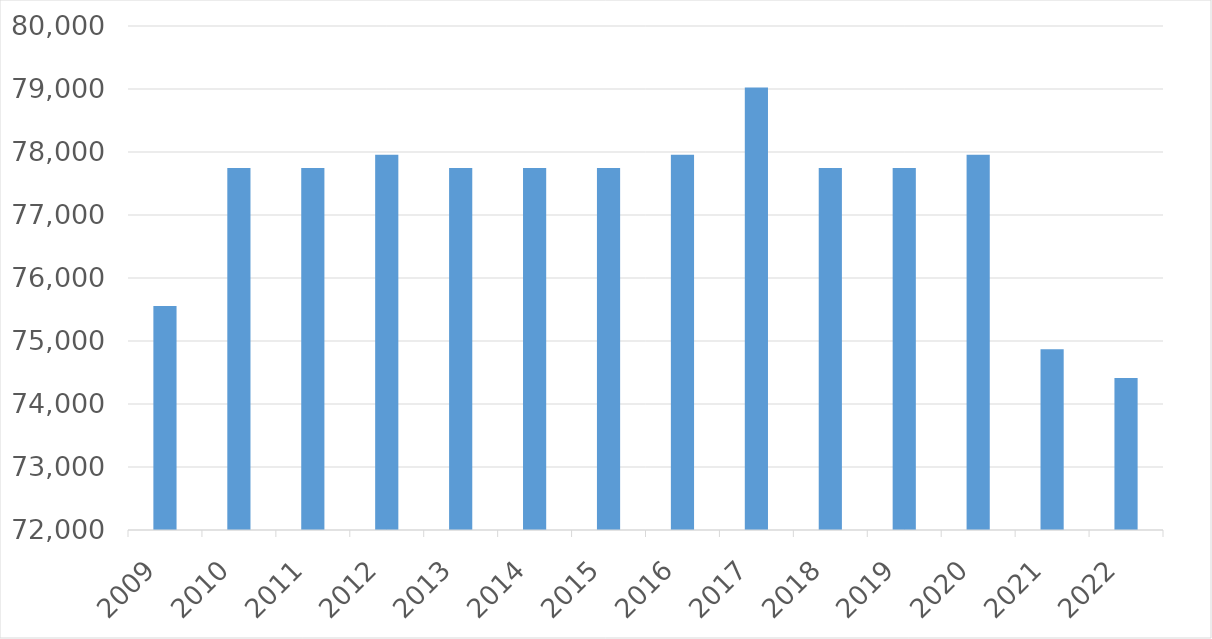
| Category | Series 0 |
|---|---|
| 2009 | 75555 |
| 2010 | 77745 |
| 2011 | 77745 |
| 2012 | 77958 |
| 2013 | 77745 |
| 2014 | 77745 |
| 2015 | 77745 |
| 2016 | 77958 |
| 2017 | 79023 |
| 2018 | 77745 |
| 2019 | 77745 |
| 2020 | 77958 |
| 2021 | 74871 |
| 2022 | 74414 |